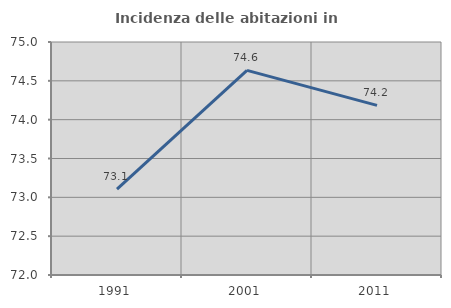
| Category | Incidenza delle abitazioni in proprietà  |
|---|---|
| 1991.0 | 73.105 |
| 2001.0 | 74.634 |
| 2011.0 | 74.184 |